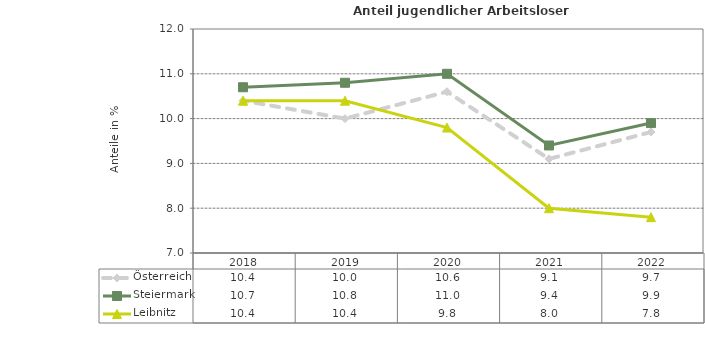
| Category | Österreich | Steiermark | Leibnitz |
|---|---|---|---|
| 2022.0 | 9.7 | 9.9 | 7.8 |
| 2021.0 | 9.1 | 9.4 | 8 |
| 2020.0 | 10.6 | 11 | 9.8 |
| 2019.0 | 10 | 10.8 | 10.4 |
| 2018.0 | 10.4 | 10.7 | 10.4 |